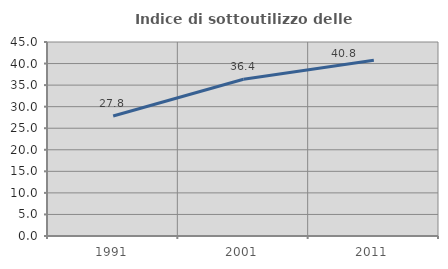
| Category | Indice di sottoutilizzo delle abitazioni  |
|---|---|
| 1991.0 | 27.824 |
| 2001.0 | 36.364 |
| 2011.0 | 40.772 |